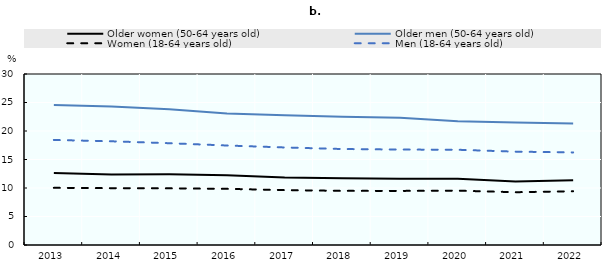
| Category | Older women (50-64 years old) | Older men (50-64 years old) | Women (18-64 years old) | Men (18-64 years old) |
|---|---|---|---|---|
| 2013 | 12.627 | 24.581 | 10.03 | 18.429 |
| 2014 | 12.369 | 24.281 | 9.97 | 18.194 |
| 2015 | 12.39 | 23.801 | 9.944 | 17.858 |
| 2016 | 12.251 | 23.074 | 9.853 | 17.455 |
| 2017 | 11.855 | 22.776 | 9.63 | 17.113 |
| 2018 | 11.727 | 22.521 | 9.499 | 16.838 |
| 2019 | 11.618 | 22.33 | 9.491 | 16.745 |
| 2020 | 11.603 | 21.699 | 9.533 | 16.709 |
| 2021 | 11.13 | 21.489 | 9.262 | 16.377 |
| 2022 | 11.378 | 21.327 | 9.43 | 16.244 |